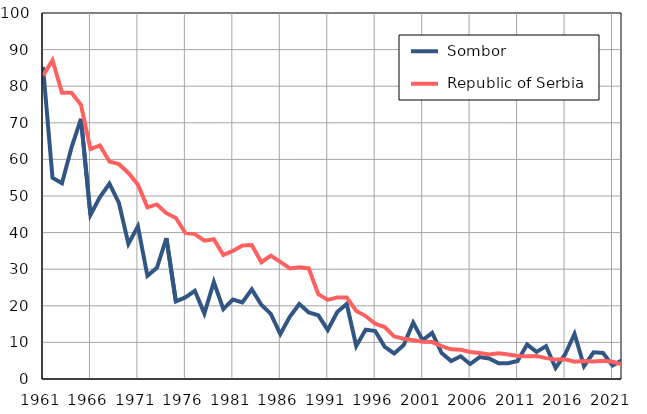
| Category |  Sombor |  Republic of Serbia |
|---|---|---|
| 1961.0 | 85.3 | 82.9 |
| 1962.0 | 55 | 87.1 |
| 1963.0 | 53.5 | 78.2 |
| 1964.0 | 63.2 | 78.2 |
| 1965.0 | 71.1 | 74.9 |
| 1966.0 | 44.8 | 62.8 |
| 1967.0 | 49.7 | 63.8 |
| 1968.0 | 53.4 | 59.4 |
| 1969.0 | 48.1 | 58.7 |
| 1970.0 | 36.9 | 56.3 |
| 1971.0 | 41.7 | 53.1 |
| 1972.0 | 28.2 | 46.9 |
| 1973.0 | 30.4 | 47.7 |
| 1974.0 | 38.5 | 45.3 |
| 1975.0 | 21.2 | 44 |
| 1976.0 | 22.3 | 39.9 |
| 1977.0 | 24.1 | 39.6 |
| 1978.0 | 17.9 | 37.8 |
| 1979.0 | 26.5 | 38.2 |
| 1980.0 | 19.1 | 33.9 |
| 1981.0 | 21.7 | 35 |
| 1982.0 | 20.9 | 36.5 |
| 1983.0 | 24.5 | 36.6 |
| 1984.0 | 20.3 | 31.9 |
| 1985.0 | 17.8 | 33.7 |
| 1986.0 | 12.3 | 32 |
| 1987.0 | 17 | 30.2 |
| 1988.0 | 20.5 | 30.5 |
| 1989.0 | 18.2 | 30.2 |
| 1990.0 | 17.4 | 23.2 |
| 1991.0 | 13.4 | 21.6 |
| 1992.0 | 18.3 | 22.3 |
| 1993.0 | 20.5 | 22.3 |
| 1994.0 | 9 | 18.6 |
| 1995.0 | 13.5 | 17.2 |
| 1996.0 | 13.1 | 15.1 |
| 1997.0 | 8.8 | 14.2 |
| 1998.0 | 7 | 11.6 |
| 1999.0 | 9.3 | 11 |
| 2000.0 | 15.4 | 10.6 |
| 2001.0 | 10.6 | 10.2 |
| 2002.0 | 12.6 | 10.1 |
| 2003.0 | 7.1 | 9 |
| 2004.0 | 4.9 | 8.1 |
| 2005.0 | 6.2 | 8 |
| 2006.0 | 4.1 | 7.4 |
| 2007.0 | 6 | 7.1 |
| 2008.0 | 5.6 | 6.7 |
| 2009.0 | 4.3 | 7 |
| 2010.0 | 4.3 | 6.7 |
| 2011.0 | 4.9 | 6.3 |
| 2012.0 | 9.4 | 6.2 |
| 2013.0 | 7.4 | 6.3 |
| 2014.0 | 9 | 5.7 |
| 2015.0 | 3 | 5.3 |
| 2016.0 | 6.7 | 5.4 |
| 2017.0 | 12.3 | 4.7 |
| 2018.0 | 3.5 | 4.9 |
| 2019.0 | 7.3 | 4.8 |
| 2020.0 | 7.1 | 5 |
| 2021.0 | 3.7 | 4.7 |
| 2022.0 | 5.1 | 4 |